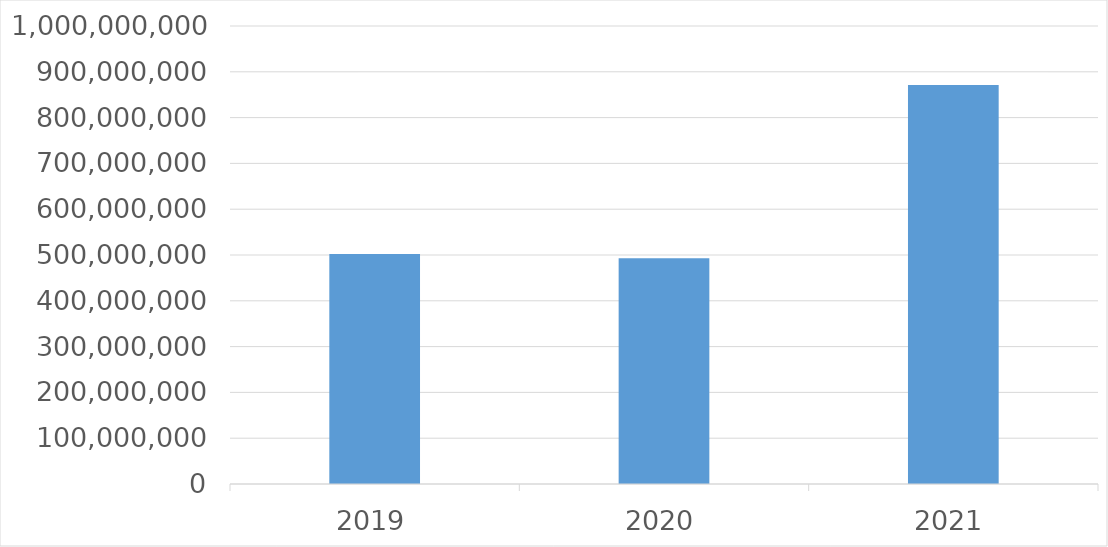
| Category | Series 0 |
|---|---|
| 2019 | 502232993 |
| 2020 | 492673536 |
| 2021 | 871152419 |